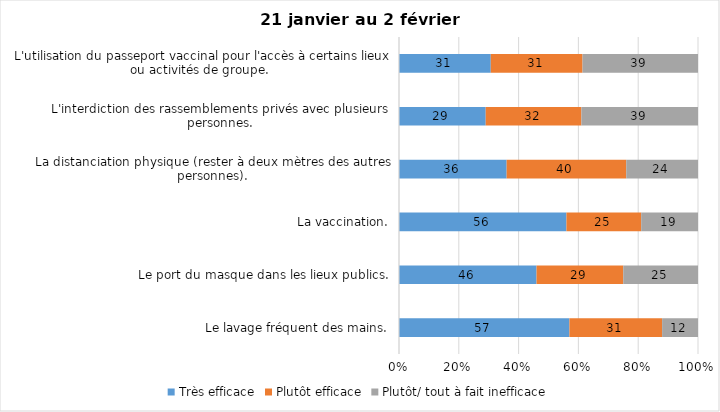
| Category | Très efficace | Plutôt efficace | Plutôt/ tout à fait inefficace |
|---|---|---|---|
| Le lavage fréquent des mains. | 57 | 31 | 12 |
| Le port du masque dans les lieux publics. | 46 | 29 | 25 |
| La vaccination. | 56 | 25 | 19 |
| La distanciation physique (rester à deux mètres des autres personnes). | 36 | 40 | 24 |
| L'interdiction des rassemblements privés avec plusieurs personnes. | 29 | 32 | 39 |
| L'utilisation du passeport vaccinal pour l'accès à certains lieux ou activités de groupe.  | 31 | 31 | 39 |